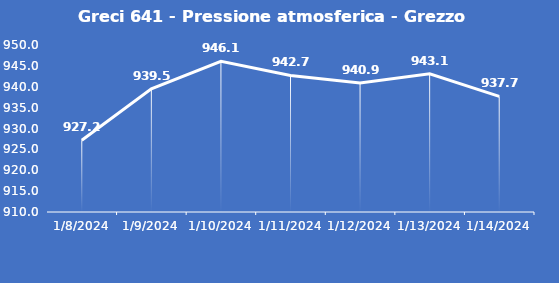
| Category | Greci 641 - Pressione atmosferica - Grezzo (hPa) |
|---|---|
| 1/8/24 | 927.2 |
| 1/9/24 | 939.5 |
| 1/10/24 | 946.1 |
| 1/11/24 | 942.7 |
| 1/12/24 | 940.9 |
| 1/13/24 | 943.1 |
| 1/14/24 | 937.7 |